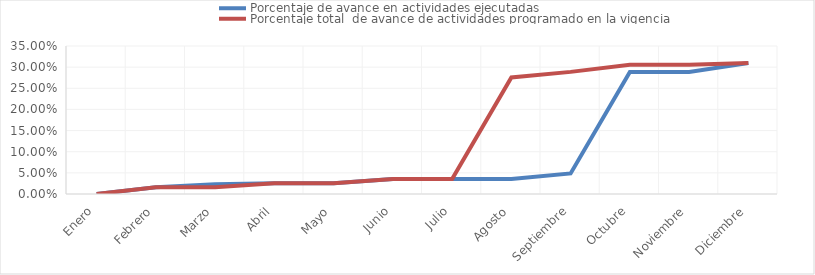
| Category | Porcentaje de avance en actividades ejecutadas | Porcentaje total  de avance de actividades programado en la vigencia |
|---|---|---|
| 0 | 0 | 0 |
| 1 | 0.016 | 0.016 |
| 2 | 0.023 | 0.016 |
| 3 | 0.026 | 0.026 |
| 4 | 0.026 | 0.026 |
| 5 | 0.035 | 0.035 |
| 6 | 0.035 | 0.035 |
| 7 | 0.035 | 0.276 |
| 8 | 0.049 | 0.289 |
| 9 | 0.289 | 0.306 |
| 10 | 0.289 | 0.306 |
| 11 | 0.31 | 0.31 |